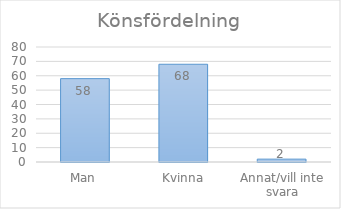
| Category | Series 0 |
|---|---|
| Man | 58 |
| Kvinna | 68 |
| Annat/vill inte svara | 2 |